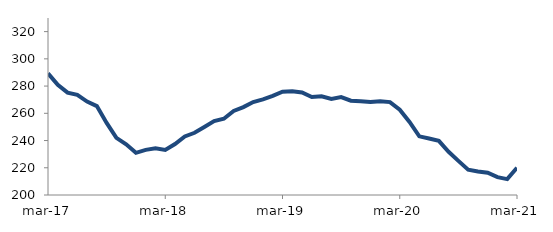
| Category | Series 0 |
|---|---|
| 2017-03-01 | 289.323 |
| 2017-04-01 | 280.971 |
| 2017-05-01 | 275.167 |
| 2017-06-01 | 273.53 |
| 2017-07-01 | 268.618 |
| 2017-08-01 | 265.289 |
| 2017-09-01 | 252.912 |
| 2017-10-01 | 242.002 |
| 2017-11-01 | 237.205 |
| 2017-12-01 | 230.992 |
| 2018-01-01 | 233.165 |
| 2018-02-01 | 234.384 |
| 2018-03-01 | 233.06 |
| 2018-04-01 | 237.465 |
| 2018-05-01 | 242.979 |
| 2018-06-01 | 245.679 |
| 2018-07-01 | 249.89 |
| 2018-08-01 | 254.238 |
| 2018-09-01 | 255.99 |
| 2018-10-01 | 261.71 |
| 2018-11-01 | 264.538 |
| 2018-12-01 | 268.288 |
| 2019-01-01 | 270.264 |
| 2019-02-01 | 272.765 |
| 2019-03-01 | 275.922 |
| 2019-04-01 | 276.17 |
| 2019-05-01 | 275.323 |
| 2019-06-01 | 271.933 |
| 2019-07-01 | 272.528 |
| 2019-08-01 | 270.617 |
| 2019-09-01 | 271.909 |
| 2019-10-01 | 269.246 |
| 2019-11-01 | 268.873 |
| 2019-12-01 | 268.319 |
| 2020-01-01 | 268.914 |
| 2020-02-01 | 268.233 |
| 2020-03-01 | 262.58 |
| 2020-04-01 | 253.663 |
| 2020-05-01 | 243.088 |
| 2020-06-01 | 241.541 |
| 2020-07-01 | 239.786 |
| 2020-08-01 | 231.766 |
| 2020-09-01 | 225.047 |
| 2020-10-01 | 218.571 |
| 2020-11-01 | 217.286 |
| 2020-12-01 | 216.368 |
| 2021-01-01 | 213.087 |
| 2021-02-01 | 211.643 |
| 2021-03-01 | 220.04 |